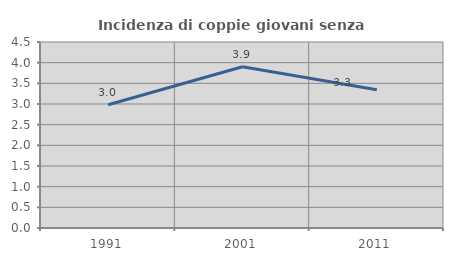
| Category | Incidenza di coppie giovani senza figli |
|---|---|
| 1991.0 | 2.981 |
| 2001.0 | 3.903 |
| 2011.0 | 3.343 |